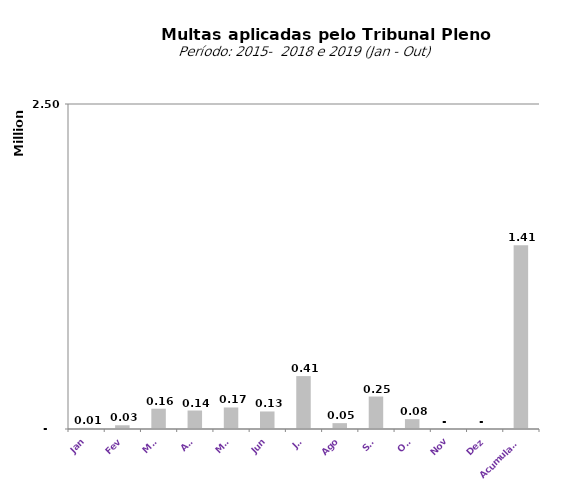
| Category |  1.528.442,62   1.020.189,59   955.160,44   1.276.425,53   2.644.178,81   1.648.289,39   21.112.065,42   6.109.976,68   8.587,38   28.774,76   156.096,39   142.268,21   165.562,13   134.846,46   406.938,07   45.095,60   249.761,95   75.658,32   -     -    |
|---|---|
| Jan | 8587.38 |
| Fev | 28774.76 |
| Mar | 156096.39 |
| Abr | 142268.21 |
| Mai | 165562.13 |
| Jun | 134846.46 |
| Jul | 406938.07 |
| Ago | 45095.6 |
| Set | 249761.95 |
| Out | 75658.32 |
| Nov | 0 |
| Dez | 0 |
| Acumulado | 1413589.27 |